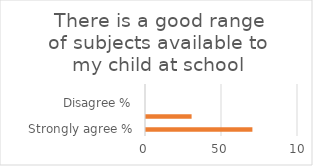
| Category | Series 1 |
|---|---|
| Strongly agree % | 70 |
| Agree % | 30 |
| Disagree % | 0 |
| Strongly disagree % | 0 |